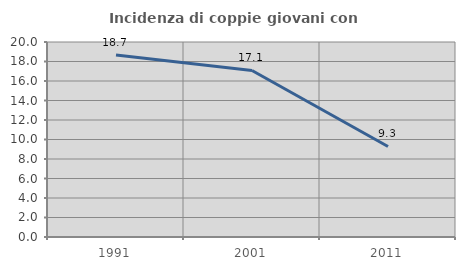
| Category | Incidenza di coppie giovani con figli |
|---|---|
| 1991.0 | 18.673 |
| 2001.0 | 17.079 |
| 2011.0 | 9.284 |